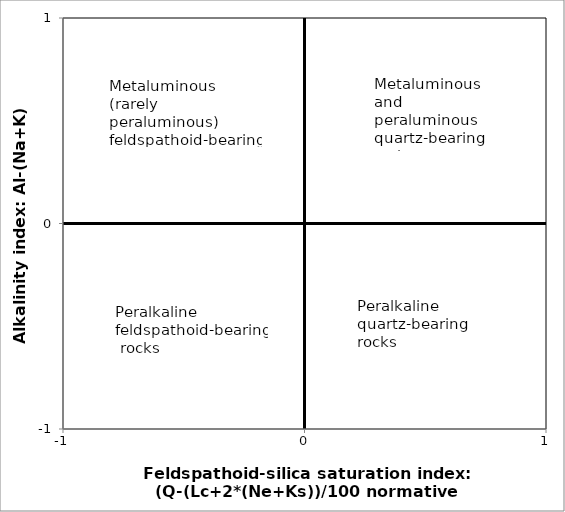
| Category | Series 0 |
|---|---|
| 10.0 | 0 |
| -10.0 | 0 |
| 0.0 | 0 |
| 0.0 | 10 |
| 0.0 | -10 |